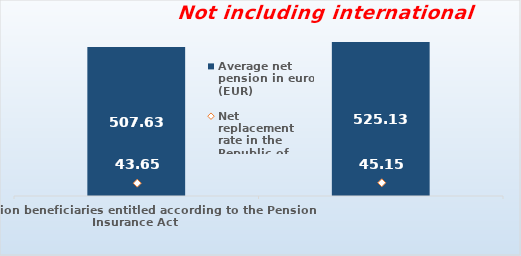
| Category | Average net pension in euros (EUR)  |
|---|---|
| Pension beneficiaries entitled according to the Pension Insurance Act   | 507.63 |
| Pension beneficiaries entitled to pension FOR THE FIRST TIME in 2023 according to the Pension Insurance Act  - NEW BENEFICIARIES | 525.131 |